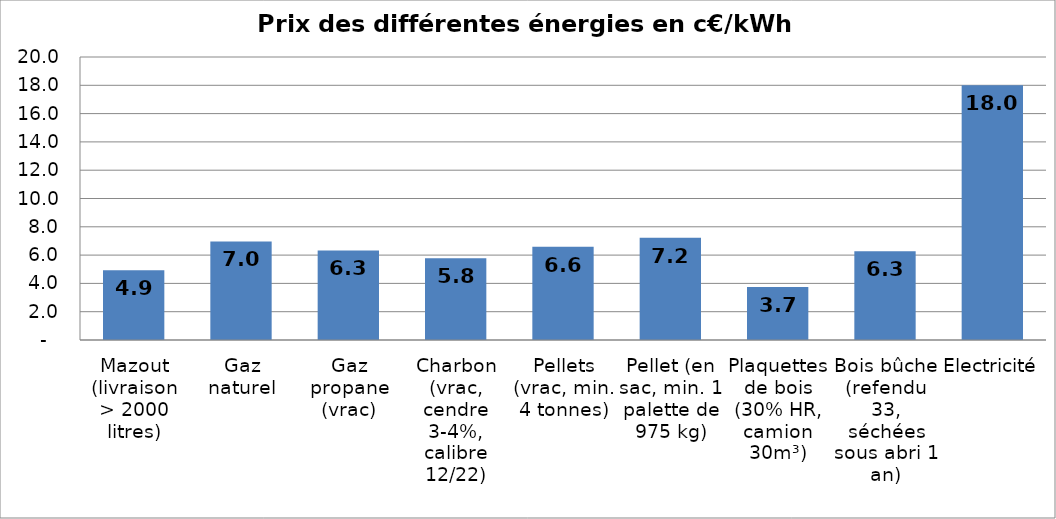
| Category | Series 0 |
|---|---|
| Mazout (livraison > 2000 litres) | 4.924 |
| Gaz naturel | 6.965 |
| Gaz propane (vrac) | 6.329 |
| Charbon (vrac, cendre 3-4%, calibre 12/22) | 5.778 |
| Pellets (vrac, min. 4 tonnes) | 6.598 |
| Pellet (en sac, min. 1 palette de 975 kg) | 7.223 |
| Plaquettes de bois (30% HR, camion 30m³) | 3.745 |
| Bois bûche (refendu 33, séchées sous abri 1 an) | 6.269 |
| Electricité | 18 |